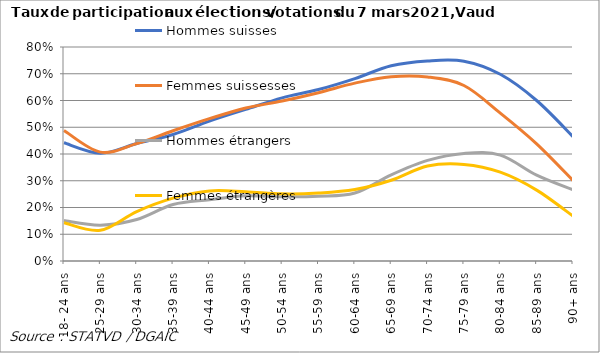
| Category | Hommes suisses | Femmes suissesses | Hommes étrangers | Femmes étrangères |
|---|---|---|---|---|
| 18- 24 ans | 0.442 | 0.488 | 0.151 | 0.143 |
| 25-29 ans | 0.403 | 0.407 | 0.134 | 0.115 |
| 30-34 ans | 0.439 | 0.439 | 0.155 | 0.185 |
| 35-39 ans | 0.473 | 0.487 | 0.211 | 0.235 |
| 40-44 ans | 0.523 | 0.532 | 0.229 | 0.262 |
| 45-49 ans | 0.567 | 0.572 | 0.244 | 0.259 |
| 50-54 ans | 0.61 | 0.598 | 0.24 | 0.251 |
| 55-59 ans | 0.641 | 0.629 | 0.242 | 0.254 |
| 60-64 ans | 0.682 | 0.665 | 0.254 | 0.267 |
| 65-69 ans | 0.73 | 0.689 | 0.322 | 0.302 |
| 70-74 ans | 0.748 | 0.688 | 0.376 | 0.355 |
| 75-79 ans | 0.747 | 0.656 | 0.402 | 0.361 |
| 80-84 ans | 0.698 | 0.553 | 0.396 | 0.332 |
| 85-89 ans | 0.6 | 0.438 | 0.321 | 0.265 |
| 90+ ans | 0.465 | 0.301 | 0.266 | 0.168 |